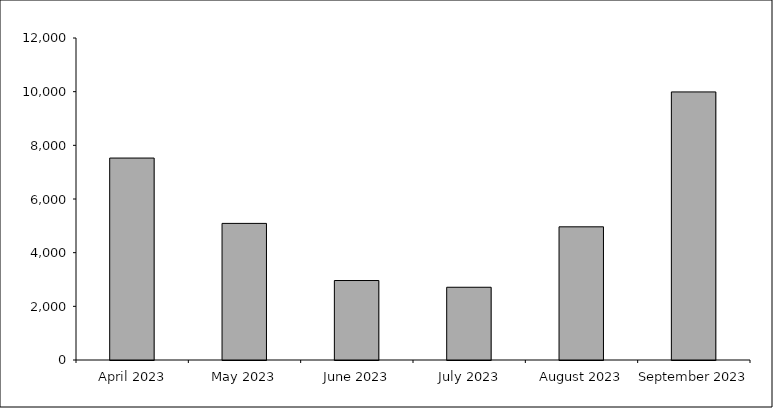
| Category | Series 0 |
|---|---|
| April 2023 | 7526 |
| May 2023 | 5091 |
| June 2023 | 2962 |
| July 2023 | 2711 |
| August 2023 | 4963 |
| September 2023 | 9990 |